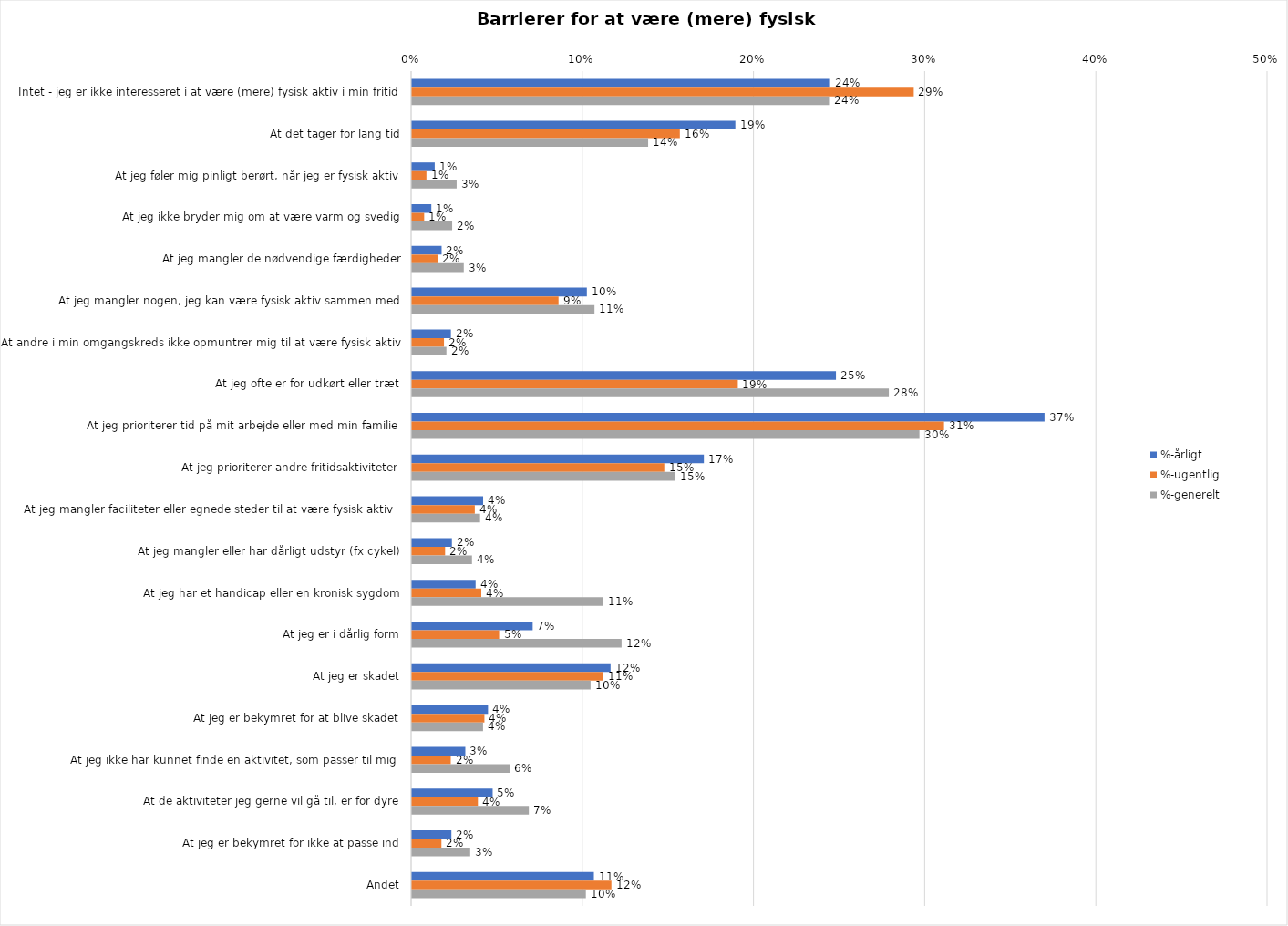
| Category | %-årligt | %-ugentlig | %-generelt |
|---|---|---|---|
| Intet - jeg er ikke interesseret i at være (mere) fysisk aktiv i min fritid | 0.244 | 0.293 | 0.244 |
| At det tager for lang tid | 0.189 | 0.156 | 0.138 |
| At jeg føler mig pinligt berørt, når jeg er fysisk aktiv | 0.013 | 0.008 | 0.026 |
| At jeg ikke bryder mig om at være varm og svedig | 0.011 | 0.007 | 0.023 |
| At jeg mangler de nødvendige færdigheder | 0.017 | 0.015 | 0.03 |
| At jeg mangler nogen, jeg kan være fysisk aktiv sammen med | 0.102 | 0.086 | 0.107 |
| At andre i min omgangskreds ikke opmuntrer mig til at være fysisk aktiv | 0.023 | 0.019 | 0.02 |
| At jeg ofte er for udkørt eller træt | 0.248 | 0.19 | 0.279 |
| At jeg prioriterer tid på mit arbejde eller med min familie | 0.369 | 0.311 | 0.296 |
| At jeg prioriterer andre fritidsaktiviteter | 0.17 | 0.147 | 0.154 |
| At jeg mangler faciliteter eller egnede steder til at være fysisk aktiv  | 0.042 | 0.037 | 0.04 |
| At jeg mangler eller har dårligt udstyr (fx cykel) | 0.023 | 0.019 | 0.035 |
| At jeg har et handicap eller en kronisk sygdom | 0.037 | 0.04 | 0.112 |
| At jeg er i dårlig form | 0.07 | 0.051 | 0.122 |
| At jeg er skadet | 0.116 | 0.112 | 0.104 |
| At jeg er bekymret for at blive skadet | 0.044 | 0.042 | 0.041 |
| At jeg ikke har kunnet finde en aktivitet, som passer til mig  | 0.031 | 0.023 | 0.057 |
| At de aktiviteter jeg gerne vil gå til, er for dyre | 0.047 | 0.038 | 0.068 |
| At jeg er bekymret for ikke at passe ind | 0.023 | 0.017 | 0.034 |
| Andet | 0.106 | 0.116 | 0.102 |